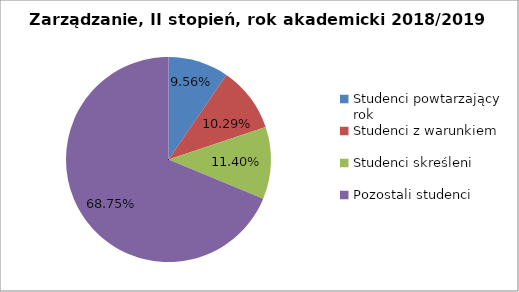
| Category | Series 0 |
|---|---|
| Studenci powtarzający rok | 26 |
| Studenci z warunkiem | 28 |
| Studenci skreśleni | 31 |
| Pozostali studenci | 187 |